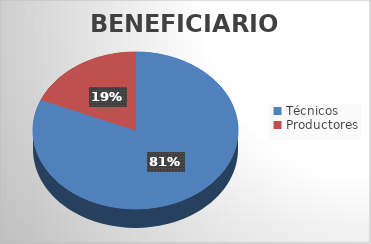
| Category | Series 0 |
|---|---|
| Técnicos  | 61 |
| Productores  | 14 |